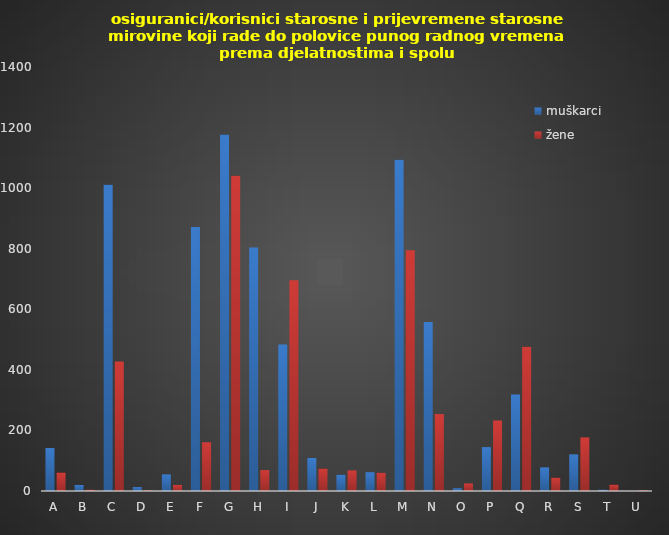
| Category | muškarci | žene |
|---|---|---|
| A | 142 | 61 |
| B | 20 | 4 |
| C | 1011 | 428 |
| D | 13 | 2 |
| E | 55 | 20 |
| F | 872 | 161 |
| G | 1177 | 1041 |
| H | 804 | 69 |
| I | 484 | 696 |
| J | 109 | 74 |
| K | 54 | 68 |
| L | 62 | 60 |
| M | 1094 | 795 |
| N | 558 | 254 |
| O | 9 | 25 |
| P | 145 | 233 |
| Q | 319 | 476 |
| R | 78 | 44 |
| S | 121 | 177 |
| T | 4 | 21 |
| U | 0 | 2 |